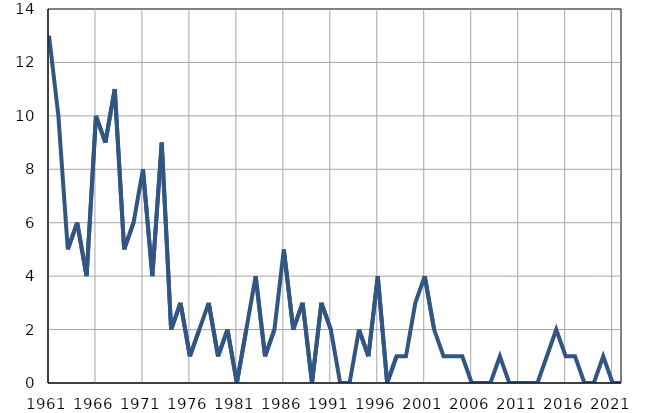
| Category | Умрла 
одојчад |
|---|---|
| 1961.0 | 13 |
| 1962.0 | 10 |
| 1963.0 | 5 |
| 1964.0 | 6 |
| 1965.0 | 4 |
| 1966.0 | 10 |
| 1967.0 | 9 |
| 1968.0 | 11 |
| 1969.0 | 5 |
| 1970.0 | 6 |
| 1971.0 | 8 |
| 1972.0 | 4 |
| 1973.0 | 9 |
| 1974.0 | 2 |
| 1975.0 | 3 |
| 1976.0 | 1 |
| 1977.0 | 2 |
| 1978.0 | 3 |
| 1979.0 | 1 |
| 1980.0 | 2 |
| 1981.0 | 0 |
| 1982.0 | 2 |
| 1983.0 | 4 |
| 1984.0 | 1 |
| 1985.0 | 2 |
| 1986.0 | 5 |
| 1987.0 | 2 |
| 1988.0 | 3 |
| 1989.0 | 0 |
| 1990.0 | 3 |
| 1991.0 | 2 |
| 1992.0 | 0 |
| 1993.0 | 0 |
| 1994.0 | 2 |
| 1995.0 | 1 |
| 1996.0 | 4 |
| 1997.0 | 0 |
| 1998.0 | 1 |
| 1999.0 | 1 |
| 2000.0 | 3 |
| 2001.0 | 4 |
| 2002.0 | 2 |
| 2003.0 | 1 |
| 2004.0 | 1 |
| 2005.0 | 1 |
| 2006.0 | 0 |
| 2007.0 | 0 |
| 2008.0 | 0 |
| 2009.0 | 1 |
| 2010.0 | 0 |
| 2011.0 | 0 |
| 2012.0 | 0 |
| 2013.0 | 0 |
| 2014.0 | 1 |
| 2015.0 | 2 |
| 2016.0 | 1 |
| 2017.0 | 1 |
| 2018.0 | 0 |
| 2019.0 | 0 |
| 2020.0 | 1 |
| 2021.0 | 0 |
| 2022.0 | 0 |